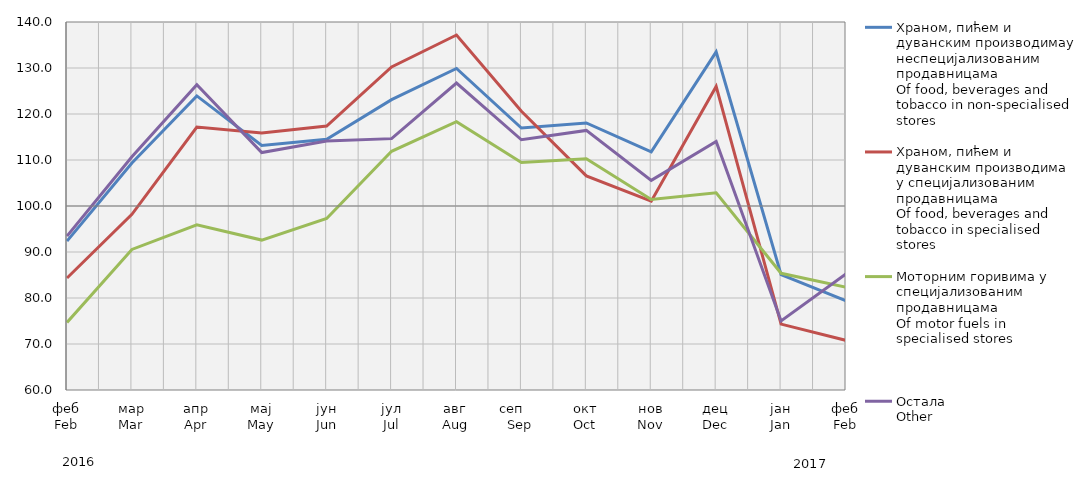
| Category | Храном, пићем и дуванским производимау неспецијализованим продавницама
Of food, beverages and tobacco in non-specialised stores
 | Храном, пићем и дуванским производима у специјализовaним продавницама
Of food, beverages and tobacco in specialised stores | Моторним горивима у специјализованим продавницама
Of motor fuels in specialised stores | Остала
Other |
|---|---|---|---|---|
| феб
Feb | 92.363 | 84.339 | 74.7 | 93.451 |
| мар
Mar | 109.349 | 98.183 | 90.564 | 110.695 |
| апр
Apr | 123.935 | 117.147 | 95.897 | 126.373 |
| мај
May | 113.15 | 115.884 | 92.592 | 111.621 |
| јун
Jun | 114.503 | 117.373 | 97.274 | 114.134 |
| јул
Jul | 123.119 | 130.235 | 111.897 | 114.647 |
| авг
Aug | 129.897 | 137.173 | 118.321 | 126.728 |
| сеп     Sep | 116.954 | 120.599 | 109.459 | 114.395 |
| окт
Oct | 118.057 | 106.539 | 110.286 | 116.429 |
| нов
Nov | 111.772 | 101.038 | 101.435 | 105.563 |
| дец
Dec | 133.518 | 125.992 | 102.88 | 114.01 |
| јан
Jan | 85.099 | 74.328 | 85.371 | 75.02 |
| феб
Feb | 79.418 | 70.792 | 82.332 | 85.25 |